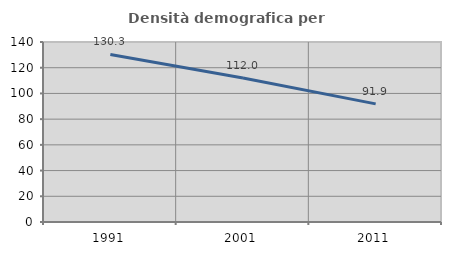
| Category | Densità demografica |
|---|---|
| 1991.0 | 130.296 |
| 2001.0 | 111.959 |
| 2011.0 | 91.887 |